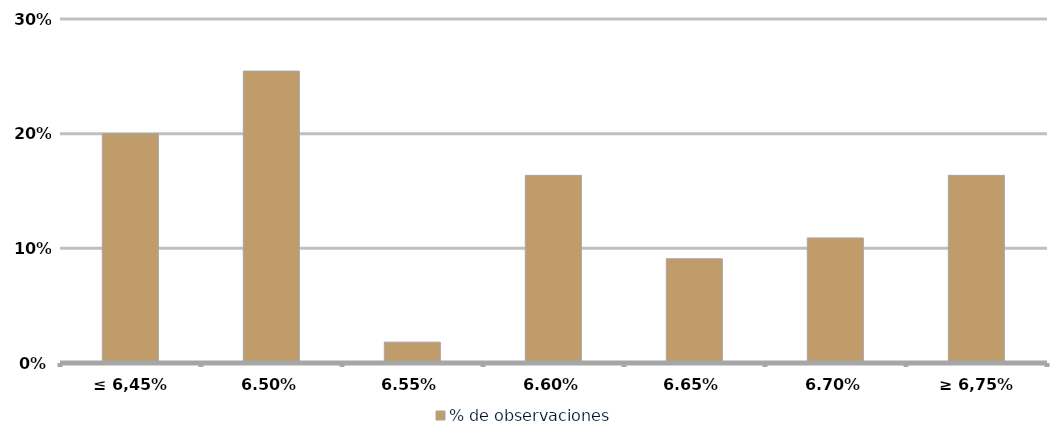
| Category | % de observaciones  |
|---|---|
| ≤ 6,45% | 0.2 |
| 6,50% | 0.255 |
| 6,55% | 0.018 |
| 6,60% | 0.164 |
| 6,65% | 0.091 |
| 6,70% | 0.109 |
| ≥ 6,75% | 0.164 |